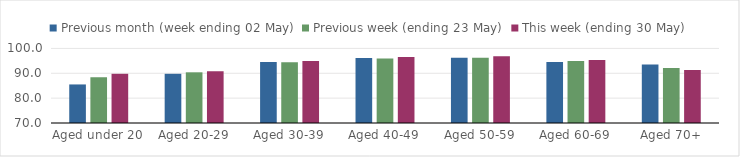
| Category | Previous month (week ending 02 May) | Previous week (ending 23 May) | This week (ending 30 May) |
|---|---|---|---|
| Aged under 20 | 85.513 | 88.405 | 89.793 |
| Aged 20-29 | 89.798 | 90.393 | 90.827 |
| Aged 30-39 | 94.542 | 94.416 | 94.917 |
| Aged 40-49 | 96.123 | 95.946 | 96.538 |
| Aged 50-59 | 96.266 | 96.213 | 96.901 |
| Aged 60-69 | 94.561 | 94.929 | 95.383 |
| Aged 70+ | 93.549 | 92.107 | 91.292 |